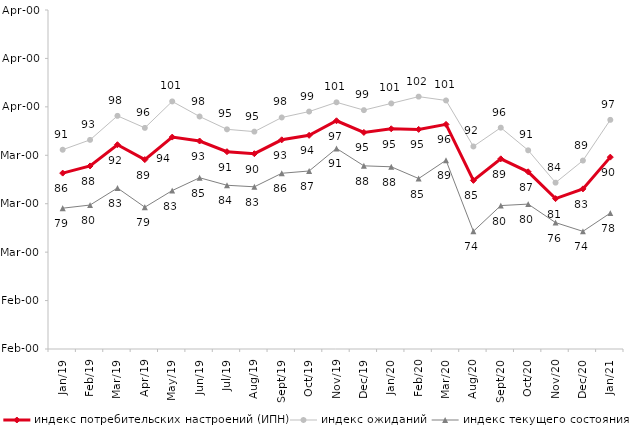
| Category | индекс потребительских настроений (ИПН) | Series 0 | индекс ожиданий | Series 3 | индекс текущего состояния |
|---|---|---|---|---|---|
| 2019-01-01 | 86.32 | 2019-01-01 | 91.15 | 2019-01-01 | 79.075 |
| 2019-02-01 | 87.8 | 2019-02-01 | 93.183 | 2019-02-01 | 79.725 |
| 2019-03-01 | 92.183 | 2019-03-01 | 98.144 | 2019-03-01 | 83.242 |
| 2019-04-01 | 89.109 | 2019-04-01 | 95.66 | 2019-04-01 | 79.282 |
| 2019-05-01 | 93.759 | 2019-05-01 | 101.123 | 2019-05-01 | 82.714 |
| 2019-06-01 | 92.948 | 2019-06-01 | 98.005 | 2019-06-01 | 85.362 |
| 2019-07-01 | 90.743 | 2019-07-01 | 95.363 | 2019-07-01 | 83.812 |
| 2019-08-01 | 90.33 | 2019-08-01 | 94.888 | 2019-08-01 | 83.492 |
| 2019-09-01 | 93.198 | 2019-09-01 | 97.805 | 2019-09-01 | 86.287 |
| 2019-10-01 | 94.119 | 2019-10-01 | 99.026 | 2019-10-01 | 86.757 |
| 2019-11-01 | 97.129 | 2019-11-01 | 100.941 | 2019-11-01 | 91.411 |
| 2019-12-01 | 94.723 | 2019-12-01 | 99.323 | 2019-12-01 | 87.822 |
| 2020-01-01 | 95.475 | 2020-01-01 | 100.71 | 2020-01-01 | 87.624 |
| 2020-02-01 | 95.347 | 2020-02-01 | 102.112 | 2020-02-01 | 85.198 |
| 2020-03-01 | 96.381 | 2020-03-01 | 101.322 | 2020-03-01 | 88.969 |
| 2020-08-01 | 84.816 | 2020-08-01 | 91.824 | 2020-08-01 | 74.305 |
| 2020-09-01 | 89.268 | 2020-09-01 | 95.703 | 2020-09-01 | 79.617 |
| 2020-10-01 | 86.587 | 2020-10-01 | 91.031 | 2020-10-01 | 79.92 |
| 2020-11-01 | 81.05 | 2020-11-01 | 84.35 | 2020-11-01 | 76.1 |
| 2020-12-01 | 83.064 | 2020-12-01 | 88.911 | 2020-12-01 | 74.294 |
| 2021-01-01 | 89.617 | 2021-01-01 | 97.317 | 2021-01-01 | 78.068 |